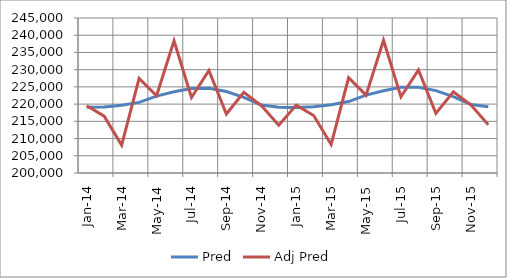
| Category | Pred | Adj Pred |
|---|---|---|
| 2014-01-01 | 219061.585 | 219524.088 |
| 2014-02-01 | 219179.989 | 216512.545 |
| 2014-03-01 | 219696.226 | 208111.778 |
| 2014-04-01 | 220507.177 | 227456.677 |
| 2014-05-01 | 222334.712 | 222431.231 |
| 2014-06-01 | 223602.365 | 238357.127 |
| 2014-07-01 | 224559.402 | 221929.843 |
| 2014-08-01 | 224612.94 | 229746.793 |
| 2014-09-01 | 223666.024 | 217111.315 |
| 2014-10-01 | 221979.641 | 223398.292 |
| 2014-11-01 | 219715.949 | 219594.406 |
| 2014-12-01 | 219098.183 | 213840.096 |
| 2015-01-01 | 219009.865 | 219709.496 |
| 2015-02-01 | 219210.548 | 216695.409 |
| 2015-03-01 | 219806.218 | 208287.547 |
| 2015-04-01 | 220745.291 | 227648.785 |
| 2015-05-01 | 222604.532 | 222619.094 |
| 2015-06-01 | 223873.144 | 238558.441 |
| 2015-07-01 | 224862.184 | 222117.283 |
| 2015-08-01 | 224886.811 | 229940.835 |
| 2015-09-01 | 223908.613 | 217294.685 |
| 2015-10-01 | 222189.913 | 223586.972 |
| 2015-11-01 | 219906.029 | 219779.873 |
| 2015-12-01 | 219255.974 | 214020.703 |